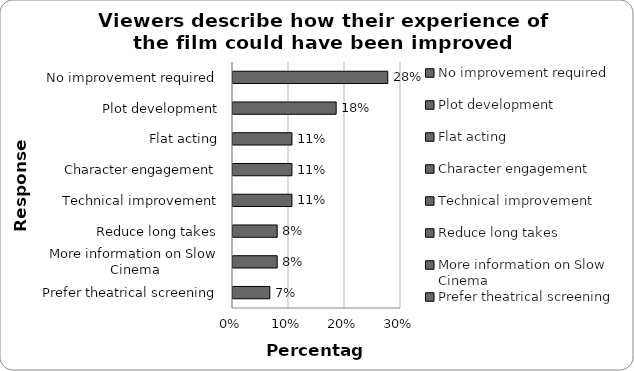
| Category | Series 0 |
|---|---|
| No improvement required | 0.276 |
| Plot development | 0.184 |
| Flat acting | 0.105 |
| Character engagement | 0.105 |
| Technical improvement | 0.105 |
| Reduce long takes | 0.079 |
| More information on Slow Cinema | 0.079 |
| Prefer theatrical screening | 0.066 |